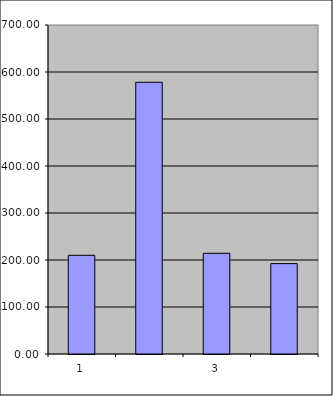
| Category | Series 0 |
|---|---|
| 0 | 210 |
| 1 | 578.15 |
| 2 | 214.266 |
| 3 | 192.348 |